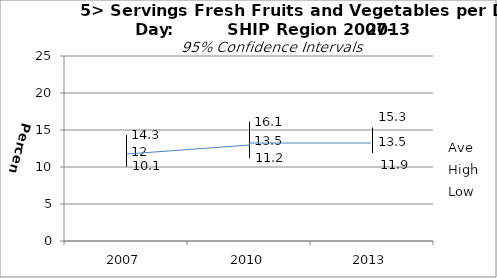
| Category | Ave | High | Low |
|---|---|---|---|
| 2007.0 | 12 | 14.3 | 10.1 |
| 2010.0 | 13.5 | 16.1 | 11.2 |
| 2013.0 | 13.5 | 15.3 | 11.9 |